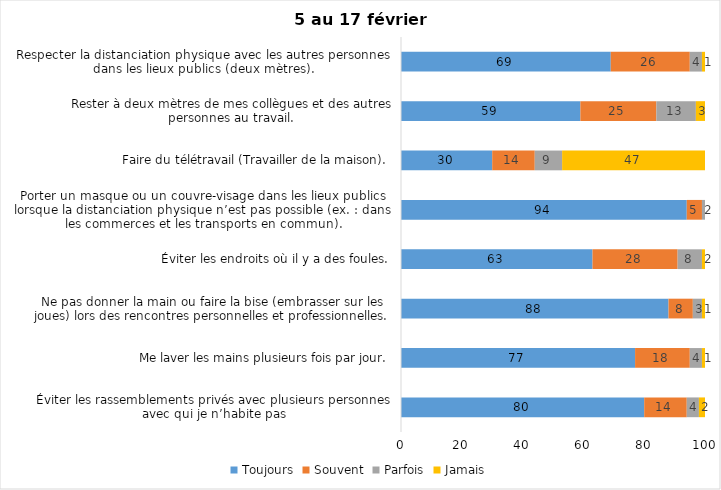
| Category | Toujours | Souvent | Parfois | Jamais |
|---|---|---|---|---|
| Éviter les rassemblements privés avec plusieurs personnes avec qui je n’habite pas | 80 | 14 | 4 | 2 |
| Me laver les mains plusieurs fois par jour. | 77 | 18 | 4 | 1 |
| Ne pas donner la main ou faire la bise (embrasser sur les joues) lors des rencontres personnelles et professionnelles. | 88 | 8 | 3 | 1 |
| Éviter les endroits où il y a des foules. | 63 | 28 | 8 | 2 |
| Porter un masque ou un couvre-visage dans les lieux publics lorsque la distanciation physique n’est pas possible (ex. : dans les commerces et les transports en commun). | 94 | 5 | 2 | 0 |
| Faire du télétravail (Travailler de la maison). | 30 | 14 | 9 | 47 |
| Rester à deux mètres de mes collègues et des autres personnes au travail. | 59 | 25 | 13 | 3 |
| Respecter la distanciation physique avec les autres personnes dans les lieux publics (deux mètres). | 69 | 26 | 4 | 1 |